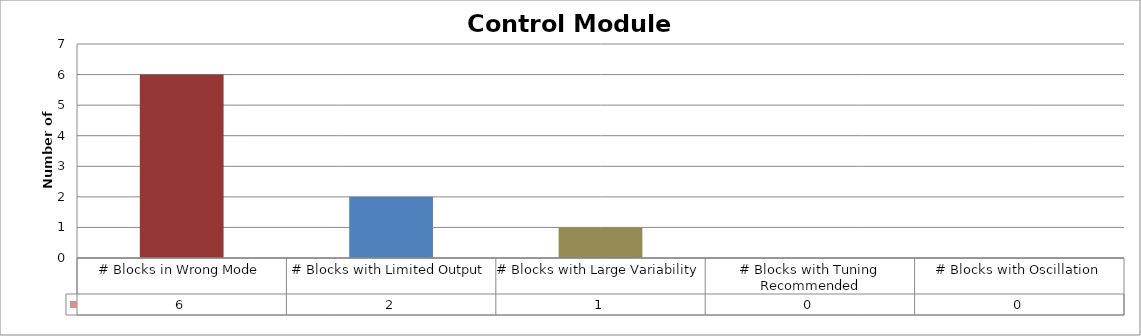
| Category | Series 1 |
|---|---|
| # Blocks in Wrong Mode | 6 |
| # Blocks with Limited Output | 2 |
| # Blocks with Large Variability | 1 |
| # Blocks with Tuning Recommended | 0 |
| # Blocks with Oscillation | 0 |